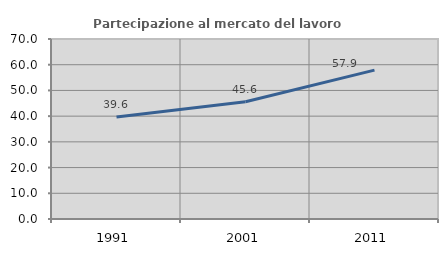
| Category | Partecipazione al mercato del lavoro  femminile |
|---|---|
| 1991.0 | 39.645 |
| 2001.0 | 45.604 |
| 2011.0 | 57.895 |